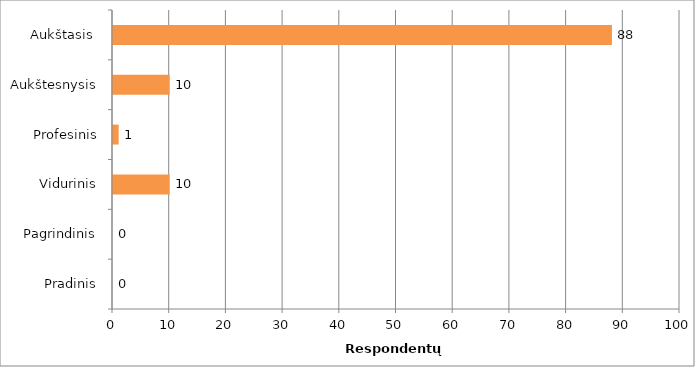
| Category | Series 0 |
|---|---|
| Pradinis | 0 |
| Pagrindinis | 0 |
| Vidurinis | 10 |
| Profesinis | 1 |
| Aukštesnysis | 10 |
| Aukštasis  | 88 |